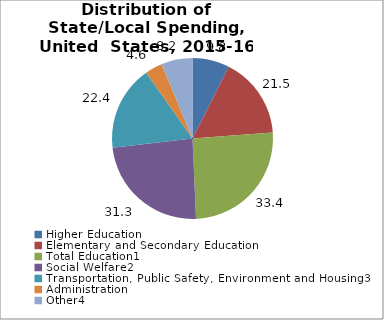
| Category | Series 0 |
|---|---|
| Higher Education | 9.763 |
| Elementary and Secondary Education | 21.463 |
| Total Education1 | 33.41 |
| Social Welfare2 | 31.297 |
| Transportation, Public Safety, Environment and Housing3 | 22.382 |
| Administration | 4.583 |
| Other4 | 8.213 |